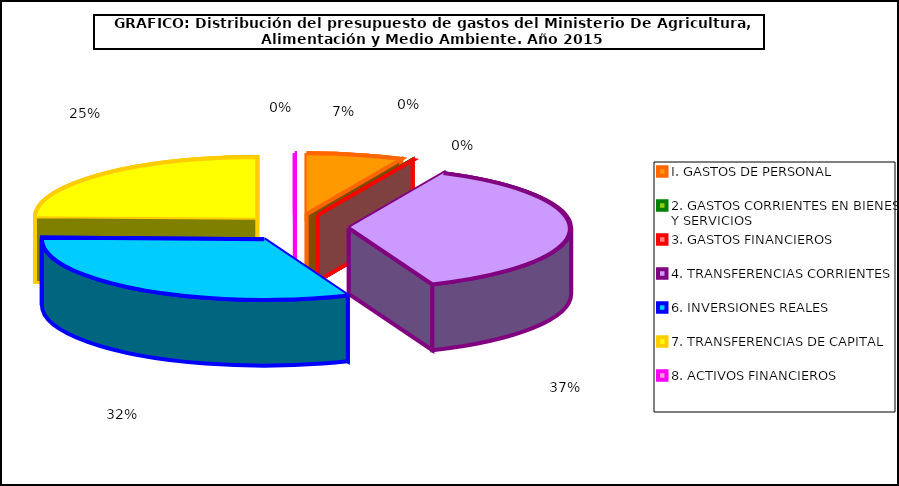
| Category | Series 0 |
|---|---|
| I. GASTOS DE PERSONAL | 29178000 |
| 2. GASTOS CORRIENTES EN BIENES Y SERVICIOS | 0 |
| 3. GASTOS FINANCIEROS | 55500 |
| 4. TRANSFERENCIAS CORRIENTES | 153805620 |
| 6. INVERSIONES REALES | 131622820 |
| 7. TRANSFERENCIAS DE CAPITAL | 102595210 |
| 8. ACTIVOS FINANCIEROS | 6020 |